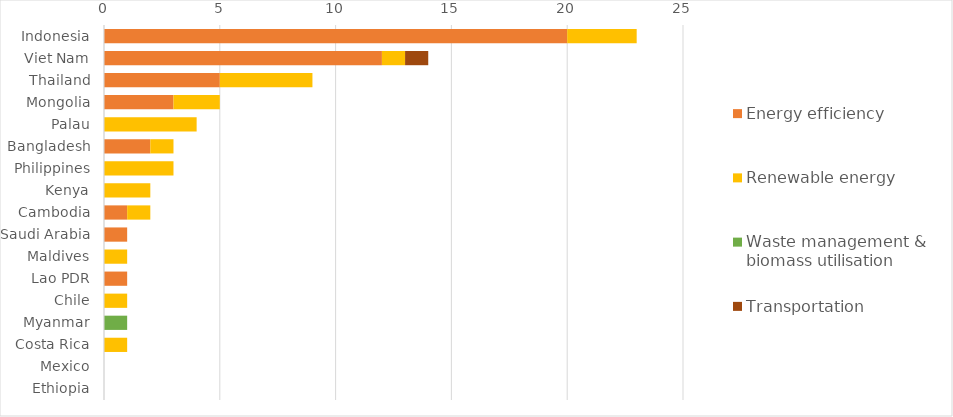
| Category | Energy efficiency | Renewable energy | Waste management & biomass utilisation | Transportation |
|---|---|---|---|---|
| Indonesia | 20 | 3 | 0 | 0 |
| Viet Nam | 12 | 1 | 0 | 1 |
| Thailand | 5 | 4 | 0 | 0 |
| Mongolia | 3 | 2 | 0 | 0 |
| Palau | 0 | 4 | 0 | 0 |
| Bangladesh | 2 | 1 | 0 | 0 |
| Philippines | 0 | 3 | 0 | 0 |
| Kenya | 0 | 2 | 0 | 0 |
| Cambodia | 1 | 1 | 0 | 0 |
| Saudi Arabia | 1 | 0 | 0 | 0 |
| Maldives | 0 | 1 | 0 | 0 |
| Lao PDR | 1 | 0 | 0 | 0 |
| Chile | 0 | 1 | 0 | 0 |
| Myanmar | 0 | 0 | 1 | 0 |
| Costa Rica | 0 | 1 | 0 | 0 |
| Mexico | 0 | 0 | 0 | 0 |
| Ethiopia | 0 | 0 | 0 | 0 |